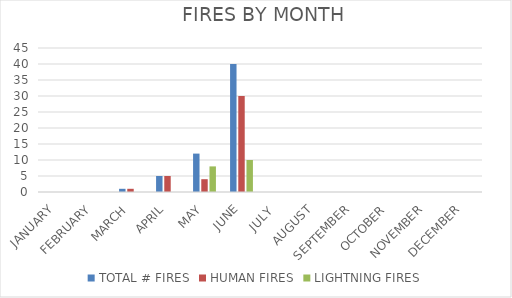
| Category | TOTAL # FIRES | HUMAN FIRES | LIGHTNING FIRES |
|---|---|---|---|
| JANUARY | 0 | 0 | 0 |
| FEBRUARY | 0 | 0 | 0 |
| MARCH | 1 | 1 | 0 |
| APRIL | 5 | 5 | 0 |
| MAY | 12 | 4 | 8 |
| JUNE | 40 | 30 | 10 |
| JULY  | 0 | 0 | 0 |
| AUGUST | 0 | 0 | 0 |
| SEPTEMBER | 0 | 0 | 0 |
| OCTOBER | 0 | 0 | 0 |
| NOVEMBER | 0 | 0 | 0 |
| DECEMBER | 0 | 0 | 0 |